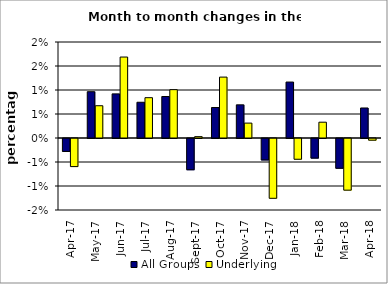
| Category | All Groups | Underlying |
|---|---|---|
| 2017-04-01 | -0.003 | -0.006 |
| 2017-05-01 | 0.01 | 0.007 |
| 2017-06-01 | 0.009 | 0.017 |
| 2017-07-01 | 0.007 | 0.008 |
| 2017-08-01 | 0.009 | 0.01 |
| 2017-09-01 | -0.007 | 0 |
| 2017-10-01 | 0.006 | 0.013 |
| 2017-11-01 | 0.007 | 0.003 |
| 2017-12-01 | -0.004 | -0.012 |
| 2018-01-01 | 0.012 | -0.004 |
| 2018-02-01 | -0.004 | 0.003 |
| 2018-03-01 | -0.006 | -0.011 |
| 2018-04-01 | 0.006 | 0 |